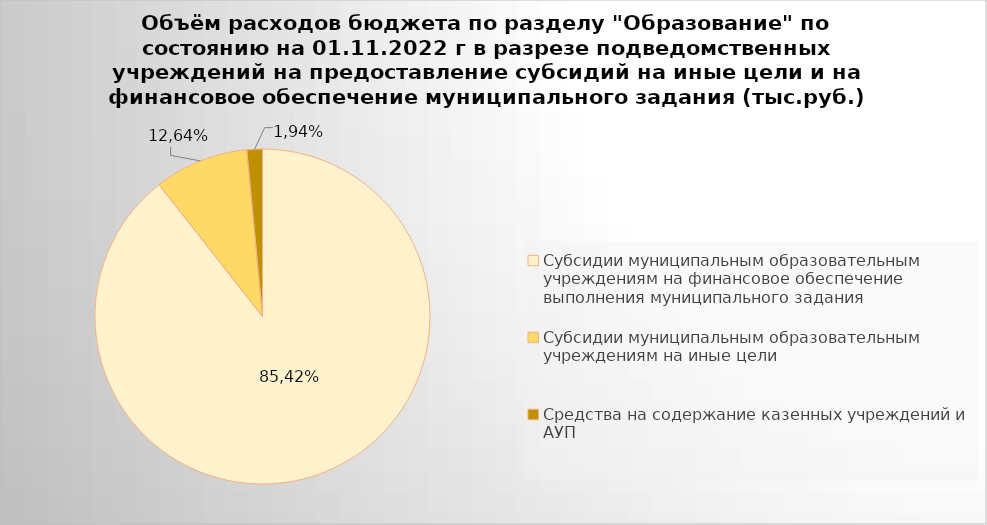
| Category | Series 0 |
|---|---|
| Субсидии муниципальным образовательным учреждениям на финансовое обеспечение выполнения муниципального задания | 7046373.34 |
| Субсидии муниципальным образовательным учреждениям на иные цели | 717656.68 |
| Средства на содержание казенных учреждений и АУП | 117820.23 |